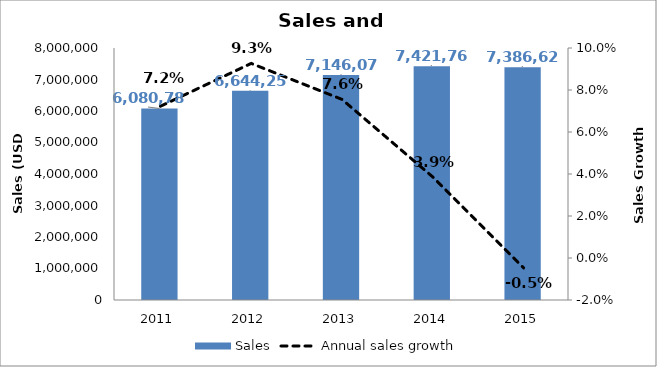
| Category | Sales |
|---|---|
| 2011.0 | 6080788 |
| 2012.0 | 6644252 |
| 2013.0 | 7146079 |
| 2014.0 | 7421768 |
| 2015.0 | 7386626 |